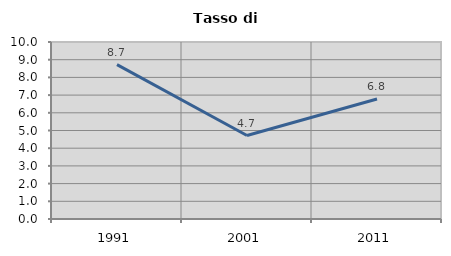
| Category | Tasso di disoccupazione   |
|---|---|
| 1991.0 | 8.725 |
| 2001.0 | 4.717 |
| 2011.0 | 6.778 |